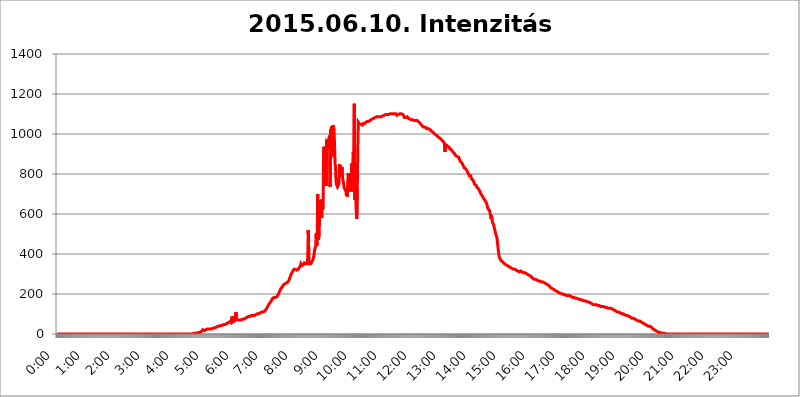
| Category | 2015.06.10. Intenzitás [W/m^2] |
|---|---|
| 0.0 | 0 |
| 0.0006944444444444445 | 0 |
| 0.001388888888888889 | 0 |
| 0.0020833333333333333 | 0 |
| 0.002777777777777778 | 0 |
| 0.003472222222222222 | 0 |
| 0.004166666666666667 | 0 |
| 0.004861111111111111 | 0 |
| 0.005555555555555556 | 0 |
| 0.0062499999999999995 | 0 |
| 0.006944444444444444 | 0 |
| 0.007638888888888889 | 0 |
| 0.008333333333333333 | 0 |
| 0.009027777777777779 | 0 |
| 0.009722222222222222 | 0 |
| 0.010416666666666666 | 0 |
| 0.011111111111111112 | 0 |
| 0.011805555555555555 | 0 |
| 0.012499999999999999 | 0 |
| 0.013194444444444444 | 0 |
| 0.013888888888888888 | 0 |
| 0.014583333333333332 | 0 |
| 0.015277777777777777 | 0 |
| 0.015972222222222224 | 0 |
| 0.016666666666666666 | 0 |
| 0.017361111111111112 | 0 |
| 0.018055555555555557 | 0 |
| 0.01875 | 0 |
| 0.019444444444444445 | 0 |
| 0.02013888888888889 | 0 |
| 0.020833333333333332 | 0 |
| 0.02152777777777778 | 0 |
| 0.022222222222222223 | 0 |
| 0.02291666666666667 | 0 |
| 0.02361111111111111 | 0 |
| 0.024305555555555556 | 0 |
| 0.024999999999999998 | 0 |
| 0.025694444444444447 | 0 |
| 0.02638888888888889 | 0 |
| 0.027083333333333334 | 0 |
| 0.027777777777777776 | 0 |
| 0.02847222222222222 | 0 |
| 0.029166666666666664 | 0 |
| 0.029861111111111113 | 0 |
| 0.030555555555555555 | 0 |
| 0.03125 | 0 |
| 0.03194444444444445 | 0 |
| 0.03263888888888889 | 0 |
| 0.03333333333333333 | 0 |
| 0.034027777777777775 | 0 |
| 0.034722222222222224 | 0 |
| 0.035416666666666666 | 0 |
| 0.036111111111111115 | 0 |
| 0.03680555555555556 | 0 |
| 0.0375 | 0 |
| 0.03819444444444444 | 0 |
| 0.03888888888888889 | 0 |
| 0.03958333333333333 | 0 |
| 0.04027777777777778 | 0 |
| 0.04097222222222222 | 0 |
| 0.041666666666666664 | 0 |
| 0.042361111111111106 | 0 |
| 0.04305555555555556 | 0 |
| 0.043750000000000004 | 0 |
| 0.044444444444444446 | 0 |
| 0.04513888888888889 | 0 |
| 0.04583333333333334 | 0 |
| 0.04652777777777778 | 0 |
| 0.04722222222222222 | 0 |
| 0.04791666666666666 | 0 |
| 0.04861111111111111 | 0 |
| 0.049305555555555554 | 0 |
| 0.049999999999999996 | 0 |
| 0.05069444444444445 | 0 |
| 0.051388888888888894 | 0 |
| 0.052083333333333336 | 0 |
| 0.05277777777777778 | 0 |
| 0.05347222222222222 | 0 |
| 0.05416666666666667 | 0 |
| 0.05486111111111111 | 0 |
| 0.05555555555555555 | 0 |
| 0.05625 | 0 |
| 0.05694444444444444 | 0 |
| 0.057638888888888885 | 0 |
| 0.05833333333333333 | 0 |
| 0.05902777777777778 | 0 |
| 0.059722222222222225 | 0 |
| 0.06041666666666667 | 0 |
| 0.061111111111111116 | 0 |
| 0.06180555555555556 | 0 |
| 0.0625 | 0 |
| 0.06319444444444444 | 0 |
| 0.06388888888888888 | 0 |
| 0.06458333333333334 | 0 |
| 0.06527777777777778 | 0 |
| 0.06597222222222222 | 0 |
| 0.06666666666666667 | 0 |
| 0.06736111111111111 | 0 |
| 0.06805555555555555 | 0 |
| 0.06874999999999999 | 0 |
| 0.06944444444444443 | 0 |
| 0.07013888888888889 | 0 |
| 0.07083333333333333 | 0 |
| 0.07152777777777779 | 0 |
| 0.07222222222222223 | 0 |
| 0.07291666666666667 | 0 |
| 0.07361111111111111 | 0 |
| 0.07430555555555556 | 0 |
| 0.075 | 0 |
| 0.07569444444444444 | 0 |
| 0.0763888888888889 | 0 |
| 0.07708333333333334 | 0 |
| 0.07777777777777778 | 0 |
| 0.07847222222222222 | 0 |
| 0.07916666666666666 | 0 |
| 0.0798611111111111 | 0 |
| 0.08055555555555556 | 0 |
| 0.08125 | 0 |
| 0.08194444444444444 | 0 |
| 0.08263888888888889 | 0 |
| 0.08333333333333333 | 0 |
| 0.08402777777777777 | 0 |
| 0.08472222222222221 | 0 |
| 0.08541666666666665 | 0 |
| 0.08611111111111112 | 0 |
| 0.08680555555555557 | 0 |
| 0.08750000000000001 | 0 |
| 0.08819444444444445 | 0 |
| 0.08888888888888889 | 0 |
| 0.08958333333333333 | 0 |
| 0.09027777777777778 | 0 |
| 0.09097222222222222 | 0 |
| 0.09166666666666667 | 0 |
| 0.09236111111111112 | 0 |
| 0.09305555555555556 | 0 |
| 0.09375 | 0 |
| 0.09444444444444444 | 0 |
| 0.09513888888888888 | 0 |
| 0.09583333333333333 | 0 |
| 0.09652777777777777 | 0 |
| 0.09722222222222222 | 0 |
| 0.09791666666666667 | 0 |
| 0.09861111111111111 | 0 |
| 0.09930555555555555 | 0 |
| 0.09999999999999999 | 0 |
| 0.10069444444444443 | 0 |
| 0.1013888888888889 | 0 |
| 0.10208333333333335 | 0 |
| 0.10277777777777779 | 0 |
| 0.10347222222222223 | 0 |
| 0.10416666666666667 | 0 |
| 0.10486111111111111 | 0 |
| 0.10555555555555556 | 0 |
| 0.10625 | 0 |
| 0.10694444444444444 | 0 |
| 0.1076388888888889 | 0 |
| 0.10833333333333334 | 0 |
| 0.10902777777777778 | 0 |
| 0.10972222222222222 | 0 |
| 0.1111111111111111 | 0 |
| 0.11180555555555556 | 0 |
| 0.11180555555555556 | 0 |
| 0.1125 | 0 |
| 0.11319444444444444 | 0 |
| 0.11388888888888889 | 0 |
| 0.11458333333333333 | 0 |
| 0.11527777777777777 | 0 |
| 0.11597222222222221 | 0 |
| 0.11666666666666665 | 0 |
| 0.1173611111111111 | 0 |
| 0.11805555555555557 | 0 |
| 0.11944444444444445 | 0 |
| 0.12013888888888889 | 0 |
| 0.12083333333333333 | 0 |
| 0.12152777777777778 | 0 |
| 0.12222222222222223 | 0 |
| 0.12291666666666667 | 0 |
| 0.12291666666666667 | 0 |
| 0.12361111111111112 | 0 |
| 0.12430555555555556 | 0 |
| 0.125 | 0 |
| 0.12569444444444444 | 0 |
| 0.12638888888888888 | 0 |
| 0.12708333333333333 | 0 |
| 0.16875 | 0 |
| 0.12847222222222224 | 0 |
| 0.12916666666666668 | 0 |
| 0.12986111111111112 | 0 |
| 0.13055555555555556 | 0 |
| 0.13125 | 0 |
| 0.13194444444444445 | 0 |
| 0.1326388888888889 | 0 |
| 0.13333333333333333 | 0 |
| 0.13402777777777777 | 0 |
| 0.13402777777777777 | 0 |
| 0.13472222222222222 | 0 |
| 0.13541666666666666 | 0 |
| 0.1361111111111111 | 0 |
| 0.13749999999999998 | 0 |
| 0.13819444444444443 | 0 |
| 0.1388888888888889 | 0 |
| 0.13958333333333334 | 0 |
| 0.14027777777777778 | 0 |
| 0.14097222222222222 | 0 |
| 0.14166666666666666 | 0 |
| 0.1423611111111111 | 0 |
| 0.14305555555555557 | 0 |
| 0.14375000000000002 | 0 |
| 0.14444444444444446 | 0 |
| 0.1451388888888889 | 0 |
| 0.1451388888888889 | 0 |
| 0.14652777777777778 | 0 |
| 0.14722222222222223 | 0 |
| 0.14791666666666667 | 0 |
| 0.1486111111111111 | 0 |
| 0.14930555555555555 | 0 |
| 0.15 | 0 |
| 0.15069444444444444 | 0 |
| 0.15138888888888888 | 0 |
| 0.15208333333333332 | 0 |
| 0.15277777777777776 | 0 |
| 0.15347222222222223 | 0 |
| 0.15416666666666667 | 0 |
| 0.15486111111111112 | 0 |
| 0.15555555555555556 | 0 |
| 0.15625 | 0 |
| 0.15694444444444444 | 0 |
| 0.15763888888888888 | 0 |
| 0.15833333333333333 | 0 |
| 0.15902777777777777 | 0 |
| 0.15972222222222224 | 0 |
| 0.16041666666666668 | 0 |
| 0.16111111111111112 | 0 |
| 0.16180555555555556 | 0 |
| 0.1625 | 0 |
| 0.16319444444444445 | 0 |
| 0.1638888888888889 | 0 |
| 0.16458333333333333 | 0 |
| 0.16527777777777777 | 0 |
| 0.16597222222222222 | 0 |
| 0.16666666666666666 | 0 |
| 0.1673611111111111 | 0 |
| 0.16805555555555554 | 0 |
| 0.16874999999999998 | 0 |
| 0.16944444444444443 | 0 |
| 0.17013888888888887 | 0 |
| 0.1708333333333333 | 0 |
| 0.17152777777777775 | 0 |
| 0.17222222222222225 | 0 |
| 0.1729166666666667 | 0 |
| 0.17361111111111113 | 0 |
| 0.17430555555555557 | 0 |
| 0.17500000000000002 | 0 |
| 0.17569444444444446 | 0 |
| 0.1763888888888889 | 0 |
| 0.17708333333333334 | 0 |
| 0.17777777777777778 | 0 |
| 0.17847222222222223 | 0 |
| 0.17916666666666667 | 0 |
| 0.1798611111111111 | 0 |
| 0.18055555555555555 | 0 |
| 0.18125 | 0 |
| 0.18194444444444444 | 0 |
| 0.1826388888888889 | 0 |
| 0.18333333333333335 | 0 |
| 0.1840277777777778 | 0 |
| 0.18472222222222223 | 0 |
| 0.18541666666666667 | 0 |
| 0.18611111111111112 | 0 |
| 0.18680555555555556 | 0 |
| 0.1875 | 0 |
| 0.18819444444444444 | 0 |
| 0.18888888888888888 | 0 |
| 0.18958333333333333 | 0 |
| 0.19027777777777777 | 0 |
| 0.1909722222222222 | 3.525 |
| 0.19166666666666665 | 3.525 |
| 0.19236111111111112 | 3.525 |
| 0.19305555555555554 | 3.525 |
| 0.19375 | 3.525 |
| 0.19444444444444445 | 3.525 |
| 0.1951388888888889 | 3.525 |
| 0.19583333333333333 | 3.525 |
| 0.19652777777777777 | 3.525 |
| 0.19722222222222222 | 7.887 |
| 0.19791666666666666 | 7.887 |
| 0.1986111111111111 | 7.887 |
| 0.19930555555555554 | 7.887 |
| 0.19999999999999998 | 7.887 |
| 0.20069444444444443 | 7.887 |
| 0.20138888888888887 | 12.257 |
| 0.2020833333333333 | 12.257 |
| 0.2027777777777778 | 12.257 |
| 0.2034722222222222 | 16.636 |
| 0.2041666666666667 | 21.024 |
| 0.20486111111111113 | 21.024 |
| 0.20555555555555557 | 16.636 |
| 0.20625000000000002 | 16.636 |
| 0.20694444444444446 | 16.636 |
| 0.2076388888888889 | 21.024 |
| 0.20833333333333334 | 21.024 |
| 0.20902777777777778 | 21.024 |
| 0.20972222222222223 | 21.024 |
| 0.21041666666666667 | 25.419 |
| 0.2111111111111111 | 25.419 |
| 0.21180555555555555 | 25.419 |
| 0.2125 | 25.419 |
| 0.21319444444444444 | 25.419 |
| 0.2138888888888889 | 25.419 |
| 0.21458333333333335 | 25.419 |
| 0.2152777777777778 | 25.419 |
| 0.21597222222222223 | 25.419 |
| 0.21666666666666667 | 25.419 |
| 0.21736111111111112 | 29.823 |
| 0.21805555555555556 | 29.823 |
| 0.21875 | 29.823 |
| 0.21944444444444444 | 29.823 |
| 0.22013888888888888 | 29.823 |
| 0.22083333333333333 | 29.823 |
| 0.22152777777777777 | 34.234 |
| 0.2222222222222222 | 34.234 |
| 0.22291666666666665 | 34.234 |
| 0.2236111111111111 | 34.234 |
| 0.22430555555555556 | 38.653 |
| 0.225 | 38.653 |
| 0.22569444444444445 | 38.653 |
| 0.2263888888888889 | 38.653 |
| 0.22708333333333333 | 38.653 |
| 0.22777777777777777 | 38.653 |
| 0.22847222222222222 | 38.653 |
| 0.22916666666666666 | 43.079 |
| 0.2298611111111111 | 43.079 |
| 0.23055555555555554 | 43.079 |
| 0.23124999999999998 | 43.079 |
| 0.23194444444444443 | 47.511 |
| 0.23263888888888887 | 47.511 |
| 0.2333333333333333 | 47.511 |
| 0.2340277777777778 | 47.511 |
| 0.2347222222222222 | 47.511 |
| 0.2354166666666667 | 47.511 |
| 0.23611111111111113 | 47.511 |
| 0.23680555555555557 | 51.951 |
| 0.23750000000000002 | 51.951 |
| 0.23819444444444446 | 51.951 |
| 0.2388888888888889 | 56.398 |
| 0.23958333333333334 | 56.398 |
| 0.24027777777777778 | 56.398 |
| 0.24097222222222223 | 56.398 |
| 0.24166666666666667 | 60.85 |
| 0.2423611111111111 | 56.398 |
| 0.24305555555555555 | 56.398 |
| 0.24375 | 56.398 |
| 0.24444444444444446 | 74.246 |
| 0.24513888888888888 | 87.692 |
| 0.24583333333333335 | 78.722 |
| 0.2465277777777778 | 60.85 |
| 0.24722222222222223 | 60.85 |
| 0.24791666666666667 | 60.85 |
| 0.24861111111111112 | 65.31 |
| 0.24930555555555556 | 69.775 |
| 0.25 | 92.184 |
| 0.25069444444444444 | 110.201 |
| 0.2513888888888889 | 74.246 |
| 0.2520833333333333 | 69.775 |
| 0.25277777777777777 | 69.775 |
| 0.2534722222222222 | 69.775 |
| 0.25416666666666665 | 69.775 |
| 0.2548611111111111 | 69.775 |
| 0.2555555555555556 | 69.775 |
| 0.25625000000000003 | 69.775 |
| 0.2569444444444445 | 69.775 |
| 0.2576388888888889 | 69.775 |
| 0.25833333333333336 | 69.775 |
| 0.2590277777777778 | 69.775 |
| 0.25972222222222224 | 74.246 |
| 0.2604166666666667 | 74.246 |
| 0.2611111111111111 | 74.246 |
| 0.26180555555555557 | 74.246 |
| 0.2625 | 78.722 |
| 0.26319444444444445 | 78.722 |
| 0.2638888888888889 | 78.722 |
| 0.26458333333333334 | 83.205 |
| 0.2652777777777778 | 83.205 |
| 0.2659722222222222 | 83.205 |
| 0.26666666666666666 | 83.205 |
| 0.2673611111111111 | 83.205 |
| 0.26805555555555555 | 87.692 |
| 0.26875 | 87.692 |
| 0.26944444444444443 | 87.692 |
| 0.2701388888888889 | 87.692 |
| 0.2708333333333333 | 92.184 |
| 0.27152777777777776 | 92.184 |
| 0.2722222222222222 | 92.184 |
| 0.27291666666666664 | 92.184 |
| 0.2736111111111111 | 92.184 |
| 0.2743055555555555 | 92.184 |
| 0.27499999999999997 | 92.184 |
| 0.27569444444444446 | 92.184 |
| 0.27638888888888885 | 92.184 |
| 0.27708333333333335 | 96.682 |
| 0.2777777777777778 | 96.682 |
| 0.27847222222222223 | 96.682 |
| 0.2791666666666667 | 96.682 |
| 0.2798611111111111 | 101.184 |
| 0.28055555555555556 | 101.184 |
| 0.28125 | 101.184 |
| 0.28194444444444444 | 101.184 |
| 0.2826388888888889 | 101.184 |
| 0.2833333333333333 | 105.69 |
| 0.28402777777777777 | 105.69 |
| 0.2847222222222222 | 105.69 |
| 0.28541666666666665 | 110.201 |
| 0.28611111111111115 | 110.201 |
| 0.28680555555555554 | 110.201 |
| 0.28750000000000003 | 110.201 |
| 0.2881944444444445 | 110.201 |
| 0.2888888888888889 | 110.201 |
| 0.28958333333333336 | 110.201 |
| 0.2902777777777778 | 114.716 |
| 0.29097222222222224 | 114.716 |
| 0.2916666666666667 | 114.716 |
| 0.2923611111111111 | 119.235 |
| 0.29305555555555557 | 123.758 |
| 0.29375 | 128.284 |
| 0.29444444444444445 | 132.814 |
| 0.2951388888888889 | 137.347 |
| 0.29583333333333334 | 141.884 |
| 0.2965277777777778 | 146.423 |
| 0.2972222222222222 | 150.964 |
| 0.29791666666666666 | 155.509 |
| 0.2986111111111111 | 155.509 |
| 0.29930555555555555 | 160.056 |
| 0.3 | 164.605 |
| 0.30069444444444443 | 169.156 |
| 0.3013888888888889 | 173.709 |
| 0.3020833333333333 | 178.264 |
| 0.30277777777777776 | 178.264 |
| 0.3034722222222222 | 182.82 |
| 0.30416666666666664 | 182.82 |
| 0.3048611111111111 | 182.82 |
| 0.3055555555555555 | 182.82 |
| 0.30624999999999997 | 182.82 |
| 0.3069444444444444 | 182.82 |
| 0.3076388888888889 | 187.378 |
| 0.30833333333333335 | 187.378 |
| 0.3090277777777778 | 191.937 |
| 0.30972222222222223 | 196.497 |
| 0.3104166666666667 | 201.058 |
| 0.3111111111111111 | 205.62 |
| 0.31180555555555556 | 210.182 |
| 0.3125 | 219.309 |
| 0.31319444444444444 | 219.309 |
| 0.3138888888888889 | 228.436 |
| 0.3145833333333333 | 228.436 |
| 0.31527777777777777 | 233 |
| 0.3159722222222222 | 237.564 |
| 0.31666666666666665 | 242.127 |
| 0.31736111111111115 | 246.689 |
| 0.31805555555555554 | 246.689 |
| 0.31875000000000003 | 251.251 |
| 0.3194444444444445 | 251.251 |
| 0.3201388888888889 | 251.251 |
| 0.32083333333333336 | 251.251 |
| 0.3215277777777778 | 255.813 |
| 0.32222222222222224 | 255.813 |
| 0.3229166666666667 | 260.373 |
| 0.3236111111111111 | 260.373 |
| 0.32430555555555557 | 264.932 |
| 0.325 | 269.49 |
| 0.32569444444444445 | 274.047 |
| 0.3263888888888889 | 283.156 |
| 0.32708333333333334 | 287.709 |
| 0.3277777777777778 | 296.808 |
| 0.3284722222222222 | 301.354 |
| 0.32916666666666666 | 305.898 |
| 0.3298611111111111 | 310.44 |
| 0.33055555555555555 | 314.98 |
| 0.33125 | 319.517 |
| 0.33194444444444443 | 324.052 |
| 0.3326388888888889 | 324.052 |
| 0.3333333333333333 | 324.052 |
| 0.3340277777777778 | 324.052 |
| 0.3347222222222222 | 324.052 |
| 0.3354166666666667 | 328.584 |
| 0.3361111111111111 | 319.517 |
| 0.3368055555555556 | 324.052 |
| 0.33749999999999997 | 319.517 |
| 0.33819444444444446 | 324.052 |
| 0.33888888888888885 | 328.584 |
| 0.33958333333333335 | 333.113 |
| 0.34027777777777773 | 337.639 |
| 0.34097222222222223 | 342.162 |
| 0.3416666666666666 | 351.198 |
| 0.3423611111111111 | 346.682 |
| 0.3430555555555555 | 342.162 |
| 0.34375 | 342.162 |
| 0.3444444444444445 | 342.162 |
| 0.3451388888888889 | 346.682 |
| 0.3458333333333334 | 351.198 |
| 0.34652777777777777 | 355.712 |
| 0.34722222222222227 | 355.712 |
| 0.34791666666666665 | 351.198 |
| 0.34861111111111115 | 351.198 |
| 0.34930555555555554 | 355.712 |
| 0.35000000000000003 | 351.198 |
| 0.3506944444444444 | 351.198 |
| 0.3513888888888889 | 387.202 |
| 0.3520833333333333 | 519.555 |
| 0.3527777777777778 | 396.164 |
| 0.3534722222222222 | 351.198 |
| 0.3541666666666667 | 346.682 |
| 0.3548611111111111 | 351.198 |
| 0.35555555555555557 | 351.198 |
| 0.35625 | 355.712 |
| 0.35694444444444445 | 360.221 |
| 0.3576388888888889 | 364.728 |
| 0.35833333333333334 | 369.23 |
| 0.3590277777777778 | 378.224 |
| 0.3597222222222222 | 387.202 |
| 0.36041666666666666 | 405.108 |
| 0.3611111111111111 | 422.943 |
| 0.36180555555555555 | 427.39 |
| 0.3625 | 440.702 |
| 0.36319444444444443 | 502.192 |
| 0.3638888888888889 | 440.702 |
| 0.3645833333333333 | 462.786 |
| 0.3652777777777778 | 699.717 |
| 0.3659722222222222 | 471.582 |
| 0.3666666666666667 | 467.187 |
| 0.3673611111111111 | 493.475 |
| 0.3680555555555556 | 609.062 |
| 0.36874999999999997 | 667.123 |
| 0.36944444444444446 | 642.4 |
| 0.37013888888888885 | 609.062 |
| 0.37083333333333335 | 579.542 |
| 0.37152777777777773 | 675.311 |
| 0.37222222222222223 | 621.613 |
| 0.3729166666666666 | 638.256 |
| 0.3736111111111111 | 936.33 |
| 0.3743055555555555 | 928.819 |
| 0.375 | 739.877 |
| 0.3756944444444445 | 767.62 |
| 0.3763888888888889 | 872.114 |
| 0.3770833333333334 | 739.877 |
| 0.37777777777777777 | 958.814 |
| 0.37847222222222227 | 958.814 |
| 0.37916666666666665 | 951.327 |
| 0.37986111111111115 | 966.295 |
| 0.38055555555555554 | 973.772 |
| 0.38125000000000003 | 966.295 |
| 0.3819444444444444 | 943.832 |
| 0.3826388888888889 | 735.89 |
| 0.3833333333333333 | 1022.323 |
| 0.3840277777777778 | 883.516 |
| 0.3847222222222222 | 1037.277 |
| 0.3854166666666667 | 894.885 |
| 0.3861111111111111 | 1011.118 |
| 0.38680555555555557 | 1044.762 |
| 0.3875 | 1048.508 |
| 0.38819444444444445 | 1022.323 |
| 0.3888888888888889 | 947.58 |
| 0.38958333333333334 | 853.029 |
| 0.3902777777777778 | 837.682 |
| 0.3909722222222222 | 763.674 |
| 0.39166666666666666 | 747.834 |
| 0.3923611111111111 | 743.859 |
| 0.39305555555555555 | 735.89 |
| 0.39375 | 735.89 |
| 0.39444444444444443 | 735.89 |
| 0.3951388888888889 | 751.803 |
| 0.3958333333333333 | 849.199 |
| 0.3965277777777778 | 787.258 |
| 0.3972222222222222 | 841.526 |
| 0.3979166666666667 | 826.123 |
| 0.3986111111111111 | 802.868 |
| 0.3993055555555556 | 833.834 |
| 0.39999999999999997 | 787.258 |
| 0.40069444444444446 | 767.62 |
| 0.40138888888888885 | 759.723 |
| 0.40208333333333335 | 735.89 |
| 0.40277777777777773 | 727.896 |
| 0.40347222222222223 | 727.896 |
| 0.4041666666666666 | 719.877 |
| 0.4048611111111111 | 711.832 |
| 0.4055555555555555 | 691.608 |
| 0.40625 | 707.8 |
| 0.4069444444444445 | 687.544 |
| 0.4076388888888889 | 691.608 |
| 0.4083333333333334 | 802.868 |
| 0.40902777777777777 | 711.832 |
| 0.40972222222222227 | 747.834 |
| 0.41041666666666665 | 787.258 |
| 0.41111111111111115 | 719.877 |
| 0.41180555555555554 | 727.896 |
| 0.41250000000000003 | 727.896 |
| 0.4131944444444444 | 853.029 |
| 0.4138888888888889 | 711.832 |
| 0.4145833333333333 | 711.832 |
| 0.4152777777777778 | 909.996 |
| 0.4159722222222222 | 795.074 |
| 0.4166666666666667 | 1150.946 |
| 0.4173611111111111 | 671.22 |
| 0.41805555555555557 | 711.832 |
| 0.41875 | 802.868 |
| 0.41944444444444445 | 613.252 |
| 0.4201388888888889 | 575.299 |
| 0.42083333333333334 | 723.889 |
| 0.4215277777777778 | 925.06 |
| 0.4222222222222222 | 1059.756 |
| 0.42291666666666666 | 1059.756 |
| 0.4236111111111111 | 1052.255 |
| 0.42430555555555555 | 1048.508 |
| 0.425 | 1048.508 |
| 0.42569444444444443 | 1048.508 |
| 0.4263888888888889 | 1044.762 |
| 0.4270833333333333 | 1048.508 |
| 0.4277777777777778 | 1044.762 |
| 0.4284722222222222 | 1048.508 |
| 0.4291666666666667 | 1052.255 |
| 0.4298611111111111 | 1048.508 |
| 0.4305555555555556 | 1052.255 |
| 0.43124999999999997 | 1052.255 |
| 0.43194444444444446 | 1052.255 |
| 0.43263888888888885 | 1056.004 |
| 0.43333333333333335 | 1059.756 |
| 0.43402777777777773 | 1059.756 |
| 0.43472222222222223 | 1059.756 |
| 0.4354166666666666 | 1063.51 |
| 0.4361111111111111 | 1063.51 |
| 0.4368055555555555 | 1067.267 |
| 0.4375 | 1063.51 |
| 0.4381944444444445 | 1067.267 |
| 0.4388888888888889 | 1067.267 |
| 0.4395833333333334 | 1071.027 |
| 0.44027777777777777 | 1071.027 |
| 0.44097222222222227 | 1074.789 |
| 0.44166666666666665 | 1074.789 |
| 0.44236111111111115 | 1074.789 |
| 0.44305555555555554 | 1074.789 |
| 0.44375000000000003 | 1078.555 |
| 0.4444444444444444 | 1078.555 |
| 0.4451388888888889 | 1078.555 |
| 0.4458333333333333 | 1082.324 |
| 0.4465277777777778 | 1086.097 |
| 0.4472222222222222 | 1086.097 |
| 0.4479166666666667 | 1086.097 |
| 0.4486111111111111 | 1086.097 |
| 0.44930555555555557 | 1086.097 |
| 0.45 | 1086.097 |
| 0.45069444444444445 | 1089.873 |
| 0.4513888888888889 | 1086.097 |
| 0.45208333333333334 | 1086.097 |
| 0.4527777777777778 | 1086.097 |
| 0.4534722222222222 | 1086.097 |
| 0.45416666666666666 | 1086.097 |
| 0.4548611111111111 | 1086.097 |
| 0.45555555555555555 | 1089.873 |
| 0.45625 | 1089.873 |
| 0.45694444444444443 | 1089.873 |
| 0.4576388888888889 | 1093.653 |
| 0.4583333333333333 | 1093.653 |
| 0.4590277777777778 | 1093.653 |
| 0.4597222222222222 | 1093.653 |
| 0.4604166666666667 | 1097.437 |
| 0.4611111111111111 | 1097.437 |
| 0.4618055555555556 | 1097.437 |
| 0.46249999999999997 | 1097.437 |
| 0.46319444444444446 | 1097.437 |
| 0.46388888888888885 | 1097.437 |
| 0.46458333333333335 | 1097.437 |
| 0.46527777777777773 | 1101.226 |
| 0.46597222222222223 | 1097.437 |
| 0.4666666666666666 | 1101.226 |
| 0.4673611111111111 | 1101.226 |
| 0.4680555555555555 | 1101.226 |
| 0.46875 | 1101.226 |
| 0.4694444444444445 | 1101.226 |
| 0.4701388888888889 | 1101.226 |
| 0.4708333333333334 | 1101.226 |
| 0.47152777777777777 | 1101.226 |
| 0.47222222222222227 | 1101.226 |
| 0.47291666666666665 | 1101.226 |
| 0.47361111111111115 | 1101.226 |
| 0.47430555555555554 | 1101.226 |
| 0.47500000000000003 | 1101.226 |
| 0.4756944444444444 | 1097.437 |
| 0.4763888888888889 | 1093.653 |
| 0.4770833333333333 | 1093.653 |
| 0.4777777777777778 | 1093.653 |
| 0.4784722222222222 | 1097.437 |
| 0.4791666666666667 | 1097.437 |
| 0.4798611111111111 | 1101.226 |
| 0.48055555555555557 | 1101.226 |
| 0.48125 | 1105.019 |
| 0.48194444444444445 | 1101.226 |
| 0.4826388888888889 | 1101.226 |
| 0.48333333333333334 | 1097.437 |
| 0.4840277777777778 | 1097.437 |
| 0.4847222222222222 | 1097.437 |
| 0.48541666666666666 | 1093.653 |
| 0.4861111111111111 | 1089.873 |
| 0.48680555555555555 | 1082.324 |
| 0.4875 | 1078.555 |
| 0.48819444444444443 | 1078.555 |
| 0.4888888888888889 | 1082.324 |
| 0.4895833333333333 | 1082.324 |
| 0.4902777777777778 | 1086.097 |
| 0.4909722222222222 | 1086.097 |
| 0.4916666666666667 | 1082.324 |
| 0.4923611111111111 | 1078.555 |
| 0.4930555555555556 | 1078.555 |
| 0.49374999999999997 | 1078.555 |
| 0.49444444444444446 | 1074.789 |
| 0.49513888888888885 | 1074.789 |
| 0.49583333333333335 | 1071.027 |
| 0.49652777777777773 | 1071.027 |
| 0.49722222222222223 | 1071.027 |
| 0.4979166666666666 | 1071.027 |
| 0.4986111111111111 | 1071.027 |
| 0.4993055555555555 | 1071.027 |
| 0.5 | 1067.267 |
| 0.5006944444444444 | 1067.267 |
| 0.5013888888888889 | 1067.267 |
| 0.5020833333333333 | 1067.267 |
| 0.5027777777777778 | 1067.267 |
| 0.5034722222222222 | 1067.267 |
| 0.5041666666666667 | 1067.267 |
| 0.5048611111111111 | 1067.267 |
| 0.5055555555555555 | 1063.51 |
| 0.50625 | 1063.51 |
| 0.5069444444444444 | 1059.756 |
| 0.5076388888888889 | 1056.004 |
| 0.5083333333333333 | 1056.004 |
| 0.5090277777777777 | 1052.255 |
| 0.5097222222222222 | 1048.508 |
| 0.5104166666666666 | 1048.508 |
| 0.5111111111111112 | 1044.762 |
| 0.5118055555555555 | 1041.019 |
| 0.5125000000000001 | 1037.277 |
| 0.5131944444444444 | 1037.277 |
| 0.513888888888889 | 1033.537 |
| 0.5145833333333333 | 1033.537 |
| 0.5152777777777778 | 1033.537 |
| 0.5159722222222222 | 1037.277 |
| 0.5166666666666667 | 1033.537 |
| 0.517361111111111 | 1029.798 |
| 0.5180555555555556 | 1029.798 |
| 0.5187499999999999 | 1026.06 |
| 0.5194444444444445 | 1022.323 |
| 0.5201388888888888 | 1026.06 |
| 0.5208333333333334 | 1026.06 |
| 0.5215277777777778 | 1022.323 |
| 0.5222222222222223 | 1022.323 |
| 0.5229166666666667 | 1022.323 |
| 0.5236111111111111 | 1018.587 |
| 0.5243055555555556 | 1014.852 |
| 0.525 | 1014.852 |
| 0.5256944444444445 | 1011.118 |
| 0.5263888888888889 | 1011.118 |
| 0.5270833333333333 | 1007.383 |
| 0.5277777777777778 | 1007.383 |
| 0.5284722222222222 | 1003.65 |
| 0.5291666666666667 | 999.916 |
| 0.5298611111111111 | 999.916 |
| 0.5305555555555556 | 996.182 |
| 0.53125 | 996.182 |
| 0.5319444444444444 | 992.448 |
| 0.5326388888888889 | 992.448 |
| 0.5333333333333333 | 988.714 |
| 0.5340277777777778 | 984.98 |
| 0.5347222222222222 | 984.98 |
| 0.5354166666666667 | 984.98 |
| 0.5361111111111111 | 981.244 |
| 0.5368055555555555 | 977.508 |
| 0.5375 | 977.508 |
| 0.5381944444444444 | 973.772 |
| 0.5388888888888889 | 970.034 |
| 0.5395833333333333 | 970.034 |
| 0.5402777777777777 | 966.295 |
| 0.5409722222222222 | 966.295 |
| 0.5416666666666666 | 962.555 |
| 0.5423611111111112 | 958.814 |
| 0.5430555555555555 | 951.327 |
| 0.5437500000000001 | 909.996 |
| 0.5444444444444444 | 947.58 |
| 0.545138888888889 | 947.58 |
| 0.5458333333333333 | 943.832 |
| 0.5465277777777778 | 943.832 |
| 0.5472222222222222 | 940.082 |
| 0.5479166666666667 | 936.33 |
| 0.548611111111111 | 940.082 |
| 0.5493055555555556 | 936.33 |
| 0.5499999999999999 | 932.576 |
| 0.5506944444444445 | 925.06 |
| 0.5513888888888888 | 921.298 |
| 0.5520833333333334 | 921.298 |
| 0.5527777777777778 | 921.298 |
| 0.5534722222222223 | 917.534 |
| 0.5541666666666667 | 913.766 |
| 0.5548611111111111 | 909.996 |
| 0.5555555555555556 | 909.996 |
| 0.55625 | 906.223 |
| 0.5569444444444445 | 902.447 |
| 0.5576388888888889 | 898.668 |
| 0.5583333333333333 | 894.885 |
| 0.5590277777777778 | 891.099 |
| 0.5597222222222222 | 891.099 |
| 0.5604166666666667 | 887.309 |
| 0.5611111111111111 | 887.309 |
| 0.5618055555555556 | 887.309 |
| 0.5625 | 887.309 |
| 0.5631944444444444 | 883.516 |
| 0.5638888888888889 | 875.918 |
| 0.5645833333333333 | 868.305 |
| 0.5652777777777778 | 868.305 |
| 0.5659722222222222 | 860.676 |
| 0.5666666666666667 | 856.855 |
| 0.5673611111111111 | 856.855 |
| 0.5680555555555555 | 853.029 |
| 0.56875 | 845.365 |
| 0.5694444444444444 | 845.365 |
| 0.5701388888888889 | 837.682 |
| 0.5708333333333333 | 829.981 |
| 0.5715277777777777 | 829.981 |
| 0.5722222222222222 | 829.981 |
| 0.5729166666666666 | 826.123 |
| 0.5736111111111112 | 822.26 |
| 0.5743055555555555 | 818.392 |
| 0.5750000000000001 | 818.392 |
| 0.5756944444444444 | 806.757 |
| 0.576388888888889 | 806.757 |
| 0.5770833333333333 | 798.974 |
| 0.5777777777777778 | 791.169 |
| 0.5784722222222222 | 791.169 |
| 0.5791666666666667 | 791.169 |
| 0.579861111111111 | 791.169 |
| 0.5805555555555556 | 783.342 |
| 0.5812499999999999 | 775.492 |
| 0.5819444444444445 | 775.492 |
| 0.5826388888888888 | 771.559 |
| 0.5833333333333334 | 767.62 |
| 0.5840277777777778 | 763.674 |
| 0.5847222222222223 | 755.766 |
| 0.5854166666666667 | 747.834 |
| 0.5861111111111111 | 743.859 |
| 0.5868055555555556 | 743.859 |
| 0.5875 | 743.859 |
| 0.5881944444444445 | 735.89 |
| 0.5888888888888889 | 735.89 |
| 0.5895833333333333 | 731.896 |
| 0.5902777777777778 | 727.896 |
| 0.5909722222222222 | 723.889 |
| 0.5916666666666667 | 723.889 |
| 0.5923611111111111 | 715.858 |
| 0.5930555555555556 | 715.858 |
| 0.59375 | 703.762 |
| 0.5944444444444444 | 703.762 |
| 0.5951388888888889 | 695.666 |
| 0.5958333333333333 | 691.608 |
| 0.5965277777777778 | 687.544 |
| 0.5972222222222222 | 683.473 |
| 0.5979166666666667 | 679.395 |
| 0.5986111111111111 | 675.311 |
| 0.5993055555555555 | 675.311 |
| 0.6 | 667.123 |
| 0.6006944444444444 | 667.123 |
| 0.6013888888888889 | 658.909 |
| 0.6020833333333333 | 654.791 |
| 0.6027777777777777 | 646.537 |
| 0.6034722222222222 | 634.105 |
| 0.6041666666666666 | 625.784 |
| 0.6048611111111112 | 621.613 |
| 0.6055555555555555 | 625.784 |
| 0.6062500000000001 | 617.436 |
| 0.6069444444444444 | 613.252 |
| 0.607638888888889 | 596.45 |
| 0.6083333333333333 | 575.299 |
| 0.6090277777777778 | 592.233 |
| 0.6097222222222222 | 575.299 |
| 0.6104166666666667 | 558.261 |
| 0.611111111111111 | 553.986 |
| 0.6118055555555556 | 549.704 |
| 0.6124999999999999 | 553.986 |
| 0.6131944444444445 | 528.2 |
| 0.6138888888888888 | 523.88 |
| 0.6145833333333334 | 506.542 |
| 0.6152777777777778 | 497.836 |
| 0.6159722222222223 | 489.108 |
| 0.6166666666666667 | 480.356 |
| 0.6173611111111111 | 458.38 |
| 0.6180555555555556 | 436.27 |
| 0.61875 | 414.035 |
| 0.6194444444444445 | 396.164 |
| 0.6201388888888889 | 382.715 |
| 0.6208333333333333 | 378.224 |
| 0.6215277777777778 | 373.729 |
| 0.6222222222222222 | 369.23 |
| 0.6229166666666667 | 364.728 |
| 0.6236111111111111 | 364.728 |
| 0.6243055555555556 | 360.221 |
| 0.625 | 360.221 |
| 0.6256944444444444 | 355.712 |
| 0.6263888888888889 | 355.712 |
| 0.6270833333333333 | 351.198 |
| 0.6277777777777778 | 351.198 |
| 0.6284722222222222 | 351.198 |
| 0.6291666666666667 | 346.682 |
| 0.6298611111111111 | 346.682 |
| 0.6305555555555555 | 346.682 |
| 0.63125 | 342.162 |
| 0.6319444444444444 | 342.162 |
| 0.6326388888888889 | 337.639 |
| 0.6333333333333333 | 337.639 |
| 0.6340277777777777 | 337.639 |
| 0.6347222222222222 | 333.113 |
| 0.6354166666666666 | 333.113 |
| 0.6361111111111112 | 333.113 |
| 0.6368055555555555 | 333.113 |
| 0.6375000000000001 | 328.584 |
| 0.6381944444444444 | 328.584 |
| 0.638888888888889 | 328.584 |
| 0.6395833333333333 | 324.052 |
| 0.6402777777777778 | 324.052 |
| 0.6409722222222222 | 324.052 |
| 0.6416666666666667 | 324.052 |
| 0.642361111111111 | 319.517 |
| 0.6430555555555556 | 319.517 |
| 0.6437499999999999 | 319.517 |
| 0.6444444444444445 | 314.98 |
| 0.6451388888888888 | 319.517 |
| 0.6458333333333334 | 314.98 |
| 0.6465277777777778 | 314.98 |
| 0.6472222222222223 | 314.98 |
| 0.6479166666666667 | 310.44 |
| 0.6486111111111111 | 314.98 |
| 0.6493055555555556 | 314.98 |
| 0.65 | 314.98 |
| 0.6506944444444445 | 310.44 |
| 0.6513888888888889 | 310.44 |
| 0.6520833333333333 | 310.44 |
| 0.6527777777777778 | 310.44 |
| 0.6534722222222222 | 305.898 |
| 0.6541666666666667 | 305.898 |
| 0.6548611111111111 | 305.898 |
| 0.6555555555555556 | 305.898 |
| 0.65625 | 305.898 |
| 0.6569444444444444 | 305.898 |
| 0.6576388888888889 | 301.354 |
| 0.6583333333333333 | 301.354 |
| 0.6590277777777778 | 301.354 |
| 0.6597222222222222 | 296.808 |
| 0.6604166666666667 | 296.808 |
| 0.6611111111111111 | 296.808 |
| 0.6618055555555555 | 292.259 |
| 0.6625 | 292.259 |
| 0.6631944444444444 | 292.259 |
| 0.6638888888888889 | 287.709 |
| 0.6645833333333333 | 287.709 |
| 0.6652777777777777 | 283.156 |
| 0.6659722222222222 | 283.156 |
| 0.6666666666666666 | 278.603 |
| 0.6673611111111111 | 278.603 |
| 0.6680555555555556 | 278.603 |
| 0.6687500000000001 | 274.047 |
| 0.6694444444444444 | 274.047 |
| 0.6701388888888888 | 274.047 |
| 0.6708333333333334 | 274.047 |
| 0.6715277777777778 | 269.49 |
| 0.6722222222222222 | 269.49 |
| 0.6729166666666666 | 269.49 |
| 0.6736111111111112 | 269.49 |
| 0.6743055555555556 | 269.49 |
| 0.6749999999999999 | 264.932 |
| 0.6756944444444444 | 264.932 |
| 0.6763888888888889 | 264.932 |
| 0.6770833333333334 | 264.932 |
| 0.6777777777777777 | 264.932 |
| 0.6784722222222223 | 260.373 |
| 0.6791666666666667 | 260.373 |
| 0.6798611111111111 | 260.373 |
| 0.6805555555555555 | 260.373 |
| 0.68125 | 260.373 |
| 0.6819444444444445 | 260.373 |
| 0.6826388888888889 | 255.813 |
| 0.6833333333333332 | 255.813 |
| 0.6840277777777778 | 251.251 |
| 0.6847222222222222 | 251.251 |
| 0.6854166666666667 | 251.251 |
| 0.686111111111111 | 251.251 |
| 0.6868055555555556 | 251.251 |
| 0.6875 | 246.689 |
| 0.6881944444444444 | 246.689 |
| 0.688888888888889 | 242.127 |
| 0.6895833333333333 | 242.127 |
| 0.6902777777777778 | 237.564 |
| 0.6909722222222222 | 237.564 |
| 0.6916666666666668 | 233 |
| 0.6923611111111111 | 233 |
| 0.6930555555555555 | 228.436 |
| 0.69375 | 228.436 |
| 0.6944444444444445 | 223.873 |
| 0.6951388888888889 | 223.873 |
| 0.6958333333333333 | 223.873 |
| 0.6965277777777777 | 219.309 |
| 0.6972222222222223 | 219.309 |
| 0.6979166666666666 | 219.309 |
| 0.6986111111111111 | 219.309 |
| 0.6993055555555556 | 214.746 |
| 0.7000000000000001 | 214.746 |
| 0.7006944444444444 | 210.182 |
| 0.7013888888888888 | 210.182 |
| 0.7020833333333334 | 210.182 |
| 0.7027777777777778 | 205.62 |
| 0.7034722222222222 | 205.62 |
| 0.7041666666666666 | 205.62 |
| 0.7048611111111112 | 201.058 |
| 0.7055555555555556 | 201.058 |
| 0.7062499999999999 | 201.058 |
| 0.7069444444444444 | 201.058 |
| 0.7076388888888889 | 201.058 |
| 0.7083333333333334 | 201.058 |
| 0.7090277777777777 | 196.497 |
| 0.7097222222222223 | 196.497 |
| 0.7104166666666667 | 196.497 |
| 0.7111111111111111 | 196.497 |
| 0.7118055555555555 | 196.497 |
| 0.7125 | 196.497 |
| 0.7131944444444445 | 191.937 |
| 0.7138888888888889 | 191.937 |
| 0.7145833333333332 | 191.937 |
| 0.7152777777777778 | 191.937 |
| 0.7159722222222222 | 191.937 |
| 0.7166666666666667 | 191.937 |
| 0.717361111111111 | 191.937 |
| 0.7180555555555556 | 191.937 |
| 0.71875 | 191.937 |
| 0.7194444444444444 | 191.937 |
| 0.720138888888889 | 187.378 |
| 0.7208333333333333 | 187.378 |
| 0.7215277777777778 | 187.378 |
| 0.7222222222222222 | 187.378 |
| 0.7229166666666668 | 182.82 |
| 0.7236111111111111 | 182.82 |
| 0.7243055555555555 | 182.82 |
| 0.725 | 182.82 |
| 0.7256944444444445 | 182.82 |
| 0.7263888888888889 | 182.82 |
| 0.7270833333333333 | 178.264 |
| 0.7277777777777777 | 178.264 |
| 0.7284722222222223 | 178.264 |
| 0.7291666666666666 | 178.264 |
| 0.7298611111111111 | 173.709 |
| 0.7305555555555556 | 173.709 |
| 0.7312500000000001 | 173.709 |
| 0.7319444444444444 | 173.709 |
| 0.7326388888888888 | 173.709 |
| 0.7333333333333334 | 173.709 |
| 0.7340277777777778 | 173.709 |
| 0.7347222222222222 | 173.709 |
| 0.7354166666666666 | 169.156 |
| 0.7361111111111112 | 169.156 |
| 0.7368055555555556 | 169.156 |
| 0.7374999999999999 | 169.156 |
| 0.7381944444444444 | 169.156 |
| 0.7388888888888889 | 169.156 |
| 0.7395833333333334 | 164.605 |
| 0.7402777777777777 | 164.605 |
| 0.7409722222222223 | 164.605 |
| 0.7416666666666667 | 164.605 |
| 0.7423611111111111 | 164.605 |
| 0.7430555555555555 | 164.605 |
| 0.74375 | 160.056 |
| 0.7444444444444445 | 160.056 |
| 0.7451388888888889 | 160.056 |
| 0.7458333333333332 | 160.056 |
| 0.7465277777777778 | 155.509 |
| 0.7472222222222222 | 155.509 |
| 0.7479166666666667 | 155.509 |
| 0.748611111111111 | 155.509 |
| 0.7493055555555556 | 155.509 |
| 0.75 | 150.964 |
| 0.7506944444444444 | 150.964 |
| 0.751388888888889 | 150.964 |
| 0.7520833333333333 | 146.423 |
| 0.7527777777777778 | 146.423 |
| 0.7534722222222222 | 146.423 |
| 0.7541666666666668 | 146.423 |
| 0.7548611111111111 | 146.423 |
| 0.7555555555555555 | 146.423 |
| 0.75625 | 146.423 |
| 0.7569444444444445 | 146.423 |
| 0.7576388888888889 | 141.884 |
| 0.7583333333333333 | 141.884 |
| 0.7590277777777777 | 141.884 |
| 0.7597222222222223 | 141.884 |
| 0.7604166666666666 | 141.884 |
| 0.7611111111111111 | 141.884 |
| 0.7618055555555556 | 137.347 |
| 0.7625000000000001 | 137.347 |
| 0.7631944444444444 | 137.347 |
| 0.7638888888888888 | 137.347 |
| 0.7645833333333334 | 137.347 |
| 0.7652777777777778 | 137.347 |
| 0.7659722222222222 | 137.347 |
| 0.7666666666666666 | 137.347 |
| 0.7673611111111112 | 132.814 |
| 0.7680555555555556 | 132.814 |
| 0.7687499999999999 | 132.814 |
| 0.7694444444444444 | 132.814 |
| 0.7701388888888889 | 132.814 |
| 0.7708333333333334 | 132.814 |
| 0.7715277777777777 | 132.814 |
| 0.7722222222222223 | 132.814 |
| 0.7729166666666667 | 128.284 |
| 0.7736111111111111 | 128.284 |
| 0.7743055555555555 | 128.284 |
| 0.775 | 128.284 |
| 0.7756944444444445 | 128.284 |
| 0.7763888888888889 | 128.284 |
| 0.7770833333333332 | 128.284 |
| 0.7777777777777778 | 123.758 |
| 0.7784722222222222 | 123.758 |
| 0.7791666666666667 | 123.758 |
| 0.779861111111111 | 119.235 |
| 0.7805555555555556 | 119.235 |
| 0.78125 | 119.235 |
| 0.7819444444444444 | 119.235 |
| 0.782638888888889 | 119.235 |
| 0.7833333333333333 | 114.716 |
| 0.7840277777777778 | 114.716 |
| 0.7847222222222222 | 114.716 |
| 0.7854166666666668 | 110.201 |
| 0.7861111111111111 | 110.201 |
| 0.7868055555555555 | 110.201 |
| 0.7875 | 110.201 |
| 0.7881944444444445 | 110.201 |
| 0.7888888888888889 | 105.69 |
| 0.7895833333333333 | 105.69 |
| 0.7902777777777777 | 105.69 |
| 0.7909722222222223 | 101.184 |
| 0.7916666666666666 | 101.184 |
| 0.7923611111111111 | 101.184 |
| 0.7930555555555556 | 101.184 |
| 0.7937500000000001 | 101.184 |
| 0.7944444444444444 | 96.682 |
| 0.7951388888888888 | 96.682 |
| 0.7958333333333334 | 96.682 |
| 0.7965277777777778 | 92.184 |
| 0.7972222222222222 | 92.184 |
| 0.7979166666666666 | 92.184 |
| 0.7986111111111112 | 92.184 |
| 0.7993055555555556 | 92.184 |
| 0.7999999999999999 | 92.184 |
| 0.8006944444444444 | 87.692 |
| 0.8013888888888889 | 87.692 |
| 0.8020833333333334 | 87.692 |
| 0.8027777777777777 | 87.692 |
| 0.8034722222222223 | 83.205 |
| 0.8041666666666667 | 83.205 |
| 0.8048611111111111 | 83.205 |
| 0.8055555555555555 | 83.205 |
| 0.80625 | 78.722 |
| 0.8069444444444445 | 78.722 |
| 0.8076388888888889 | 78.722 |
| 0.8083333333333332 | 78.722 |
| 0.8090277777777778 | 74.246 |
| 0.8097222222222222 | 74.246 |
| 0.8104166666666667 | 74.246 |
| 0.811111111111111 | 74.246 |
| 0.8118055555555556 | 74.246 |
| 0.8125 | 69.775 |
| 0.8131944444444444 | 69.775 |
| 0.813888888888889 | 69.775 |
| 0.8145833333333333 | 65.31 |
| 0.8152777777777778 | 65.31 |
| 0.8159722222222222 | 65.31 |
| 0.8166666666666668 | 65.31 |
| 0.8173611111111111 | 65.31 |
| 0.8180555555555555 | 60.85 |
| 0.81875 | 60.85 |
| 0.8194444444444445 | 60.85 |
| 0.8201388888888889 | 60.85 |
| 0.8208333333333333 | 56.398 |
| 0.8215277777777777 | 56.398 |
| 0.8222222222222223 | 51.951 |
| 0.8229166666666666 | 51.951 |
| 0.8236111111111111 | 47.511 |
| 0.8243055555555556 | 47.511 |
| 0.8250000000000001 | 47.511 |
| 0.8256944444444444 | 47.511 |
| 0.8263888888888888 | 47.511 |
| 0.8270833333333334 | 43.079 |
| 0.8277777777777778 | 43.079 |
| 0.8284722222222222 | 43.079 |
| 0.8291666666666666 | 38.653 |
| 0.8298611111111112 | 38.653 |
| 0.8305555555555556 | 38.653 |
| 0.8312499999999999 | 38.653 |
| 0.8319444444444444 | 34.234 |
| 0.8326388888888889 | 34.234 |
| 0.8333333333333334 | 34.234 |
| 0.8340277777777777 | 29.823 |
| 0.8347222222222223 | 29.823 |
| 0.8354166666666667 | 25.419 |
| 0.8361111111111111 | 25.419 |
| 0.8368055555555555 | 21.024 |
| 0.8375 | 21.024 |
| 0.8381944444444445 | 21.024 |
| 0.8388888888888889 | 16.636 |
| 0.8395833333333332 | 16.636 |
| 0.8402777777777778 | 16.636 |
| 0.8409722222222222 | 12.257 |
| 0.8416666666666667 | 12.257 |
| 0.842361111111111 | 12.257 |
| 0.8430555555555556 | 12.257 |
| 0.84375 | 7.887 |
| 0.8444444444444444 | 7.887 |
| 0.845138888888889 | 7.887 |
| 0.8458333333333333 | 7.887 |
| 0.8465277777777778 | 7.887 |
| 0.8472222222222222 | 7.887 |
| 0.8479166666666668 | 3.525 |
| 0.8486111111111111 | 3.525 |
| 0.8493055555555555 | 3.525 |
| 0.85 | 3.525 |
| 0.8506944444444445 | 3.525 |
| 0.8513888888888889 | 3.525 |
| 0.8520833333333333 | 3.525 |
| 0.8527777777777777 | 3.525 |
| 0.8534722222222223 | 0 |
| 0.8541666666666666 | 0 |
| 0.8548611111111111 | 0 |
| 0.8555555555555556 | 0 |
| 0.8562500000000001 | 0 |
| 0.8569444444444444 | 0 |
| 0.8576388888888888 | 0 |
| 0.8583333333333334 | 0 |
| 0.8590277777777778 | 0 |
| 0.8597222222222222 | 0 |
| 0.8604166666666666 | 0 |
| 0.8611111111111112 | 0 |
| 0.8618055555555556 | 0 |
| 0.8624999999999999 | 0 |
| 0.8631944444444444 | 0 |
| 0.8638888888888889 | 0 |
| 0.8645833333333334 | 0 |
| 0.8652777777777777 | 0 |
| 0.8659722222222223 | 0 |
| 0.8666666666666667 | 0 |
| 0.8673611111111111 | 0 |
| 0.8680555555555555 | 0 |
| 0.86875 | 0 |
| 0.8694444444444445 | 0 |
| 0.8701388888888889 | 0 |
| 0.8708333333333332 | 0 |
| 0.8715277777777778 | 0 |
| 0.8722222222222222 | 0 |
| 0.8729166666666667 | 0 |
| 0.873611111111111 | 0 |
| 0.8743055555555556 | 0 |
| 0.875 | 0 |
| 0.8756944444444444 | 0 |
| 0.876388888888889 | 0 |
| 0.8770833333333333 | 0 |
| 0.8777777777777778 | 0 |
| 0.8784722222222222 | 0 |
| 0.8791666666666668 | 0 |
| 0.8798611111111111 | 0 |
| 0.8805555555555555 | 0 |
| 0.88125 | 0 |
| 0.8819444444444445 | 0 |
| 0.8826388888888889 | 0 |
| 0.8833333333333333 | 0 |
| 0.8840277777777777 | 0 |
| 0.8847222222222223 | 0 |
| 0.8854166666666666 | 0 |
| 0.8861111111111111 | 0 |
| 0.8868055555555556 | 0 |
| 0.8875000000000001 | 0 |
| 0.8881944444444444 | 0 |
| 0.8888888888888888 | 0 |
| 0.8895833333333334 | 0 |
| 0.8902777777777778 | 0 |
| 0.8909722222222222 | 0 |
| 0.8916666666666666 | 0 |
| 0.8923611111111112 | 0 |
| 0.8930555555555556 | 0 |
| 0.8937499999999999 | 0 |
| 0.8944444444444444 | 0 |
| 0.8951388888888889 | 0 |
| 0.8958333333333334 | 0 |
| 0.8965277777777777 | 0 |
| 0.8972222222222223 | 0 |
| 0.8979166666666667 | 0 |
| 0.8986111111111111 | 0 |
| 0.8993055555555555 | 0 |
| 0.9 | 0 |
| 0.9006944444444445 | 0 |
| 0.9013888888888889 | 0 |
| 0.9020833333333332 | 0 |
| 0.9027777777777778 | 0 |
| 0.9034722222222222 | 0 |
| 0.9041666666666667 | 0 |
| 0.904861111111111 | 0 |
| 0.9055555555555556 | 0 |
| 0.90625 | 0 |
| 0.9069444444444444 | 0 |
| 0.907638888888889 | 0 |
| 0.9083333333333333 | 0 |
| 0.9090277777777778 | 0 |
| 0.9097222222222222 | 0 |
| 0.9104166666666668 | 0 |
| 0.9111111111111111 | 0 |
| 0.9118055555555555 | 0 |
| 0.9125 | 0 |
| 0.9131944444444445 | 0 |
| 0.9138888888888889 | 0 |
| 0.9145833333333333 | 0 |
| 0.9152777777777777 | 0 |
| 0.9159722222222223 | 0 |
| 0.9166666666666666 | 0 |
| 0.9173611111111111 | 0 |
| 0.9180555555555556 | 0 |
| 0.9187500000000001 | 0 |
| 0.9194444444444444 | 0 |
| 0.9201388888888888 | 0 |
| 0.9208333333333334 | 0 |
| 0.9215277777777778 | 0 |
| 0.9222222222222222 | 0 |
| 0.9229166666666666 | 0 |
| 0.9236111111111112 | 0 |
| 0.9243055555555556 | 0 |
| 0.9249999999999999 | 0 |
| 0.9256944444444444 | 0 |
| 0.9263888888888889 | 0 |
| 0.9270833333333334 | 0 |
| 0.9277777777777777 | 0 |
| 0.9284722222222223 | 0 |
| 0.9291666666666667 | 0 |
| 0.9298611111111111 | 0 |
| 0.9305555555555555 | 0 |
| 0.93125 | 0 |
| 0.9319444444444445 | 0 |
| 0.9326388888888889 | 0 |
| 0.9333333333333332 | 0 |
| 0.9340277777777778 | 0 |
| 0.9347222222222222 | 0 |
| 0.9354166666666667 | 0 |
| 0.936111111111111 | 0 |
| 0.9368055555555556 | 0 |
| 0.9375 | 0 |
| 0.9381944444444444 | 0 |
| 0.938888888888889 | 0 |
| 0.9395833333333333 | 0 |
| 0.9402777777777778 | 0 |
| 0.9409722222222222 | 0 |
| 0.9416666666666668 | 0 |
| 0.9423611111111111 | 0 |
| 0.9430555555555555 | 0 |
| 0.94375 | 0 |
| 0.9444444444444445 | 0 |
| 0.9451388888888889 | 0 |
| 0.9458333333333333 | 0 |
| 0.9465277777777777 | 0 |
| 0.9472222222222223 | 0 |
| 0.9479166666666666 | 0 |
| 0.9486111111111111 | 0 |
| 0.9493055555555556 | 0 |
| 0.9500000000000001 | 0 |
| 0.9506944444444444 | 0 |
| 0.9513888888888888 | 0 |
| 0.9520833333333334 | 0 |
| 0.9527777777777778 | 0 |
| 0.9534722222222222 | 0 |
| 0.9541666666666666 | 0 |
| 0.9548611111111112 | 0 |
| 0.9555555555555556 | 0 |
| 0.9562499999999999 | 0 |
| 0.9569444444444444 | 0 |
| 0.9576388888888889 | 0 |
| 0.9583333333333334 | 0 |
| 0.9590277777777777 | 0 |
| 0.9597222222222223 | 0 |
| 0.9604166666666667 | 0 |
| 0.9611111111111111 | 0 |
| 0.9618055555555555 | 0 |
| 0.9625 | 0 |
| 0.9631944444444445 | 0 |
| 0.9638888888888889 | 0 |
| 0.9645833333333332 | 0 |
| 0.9652777777777778 | 0 |
| 0.9659722222222222 | 0 |
| 0.9666666666666667 | 0 |
| 0.967361111111111 | 0 |
| 0.9680555555555556 | 0 |
| 0.96875 | 0 |
| 0.9694444444444444 | 0 |
| 0.970138888888889 | 0 |
| 0.9708333333333333 | 0 |
| 0.9715277777777778 | 0 |
| 0.9722222222222222 | 0 |
| 0.9729166666666668 | 0 |
| 0.9736111111111111 | 0 |
| 0.9743055555555555 | 0 |
| 0.975 | 0 |
| 0.9756944444444445 | 0 |
| 0.9763888888888889 | 0 |
| 0.9770833333333333 | 0 |
| 0.9777777777777777 | 0 |
| 0.9784722222222223 | 0 |
| 0.9791666666666666 | 0 |
| 0.9798611111111111 | 0 |
| 0.9805555555555556 | 0 |
| 0.9812500000000001 | 0 |
| 0.9819444444444444 | 0 |
| 0.9826388888888888 | 0 |
| 0.9833333333333334 | 0 |
| 0.9840277777777778 | 0 |
| 0.9847222222222222 | 0 |
| 0.9854166666666666 | 0 |
| 0.9861111111111112 | 0 |
| 0.9868055555555556 | 0 |
| 0.9874999999999999 | 0 |
| 0.9881944444444444 | 0 |
| 0.9888888888888889 | 0 |
| 0.9895833333333334 | 0 |
| 0.9902777777777777 | 0 |
| 0.9909722222222223 | 0 |
| 0.9916666666666667 | 0 |
| 0.9923611111111111 | 0 |
| 0.9930555555555555 | 0 |
| 0.99375 | 0 |
| 0.9944444444444445 | 0 |
| 0.9951388888888889 | 0 |
| 0.9958333333333332 | 0 |
| 0.9965277777777778 | 0 |
| 0.9972222222222222 | 0 |
| 0.9979166666666667 | 0 |
| 0.998611111111111 | 0 |
| 0.9993055555555556 | 0 |